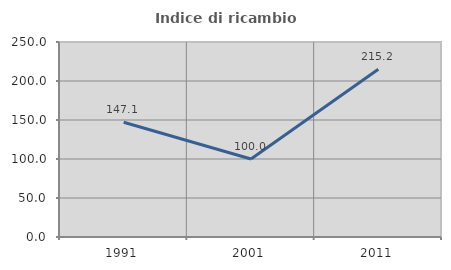
| Category | Indice di ricambio occupazionale  |
|---|---|
| 1991.0 | 147.059 |
| 2001.0 | 100 |
| 2011.0 | 215.152 |